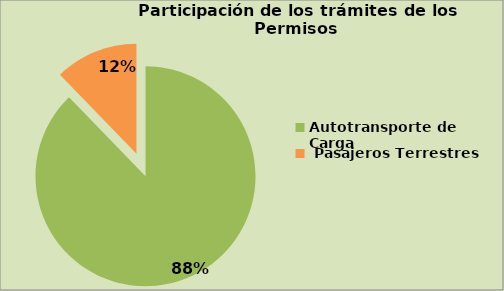
| Category | Series 0 |
|---|---|
| Autotransporte de Carga  | 87.763 |
|  Pasajeros Terrestres | 12.237 |